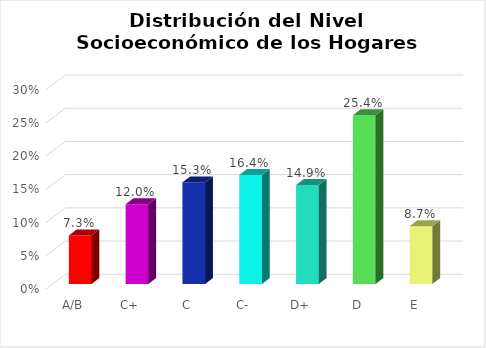
| Category | Series 0 |
|---|---|
| A/B | 0.073 |
| C+ | 0.12 |
| C | 0.153 |
| C- | 0.164 |
| D+ | 0.149 |
| D | 0.254 |
| E | 0.087 |